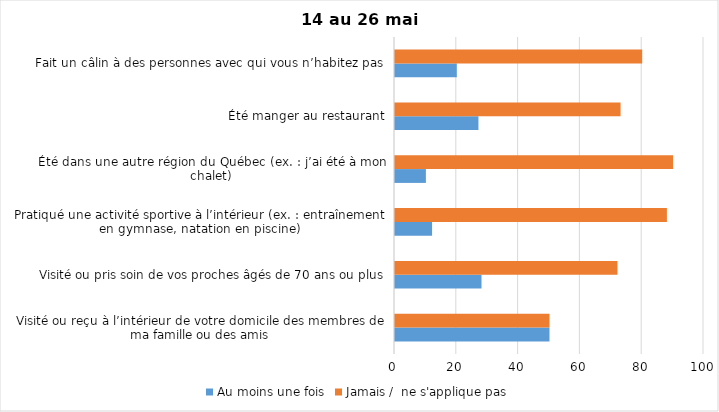
| Category | Au moins une fois | Jamais /  ne s'applique pas |
|---|---|---|
| Visité ou reçu à l’intérieur de votre domicile des membres de ma famille ou des amis | 50 | 50 |
| Visité ou pris soin de vos proches âgés de 70 ans ou plus | 28 | 72 |
| Pratiqué une activité sportive à l’intérieur (ex. : entraînement en gymnase, natation en piscine) | 12 | 88 |
| Été dans une autre région du Québec (ex. : j’ai été à mon chalet) | 10 | 90 |
| Été manger au restaurant | 27 | 73 |
| Fait un câlin à des personnes avec qui vous n’habitez pas | 20 | 80 |